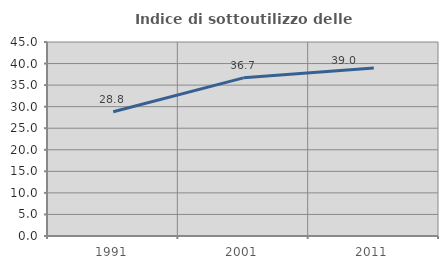
| Category | Indice di sottoutilizzo delle abitazioni  |
|---|---|
| 1991.0 | 28.804 |
| 2001.0 | 36.682 |
| 2011.0 | 38.995 |